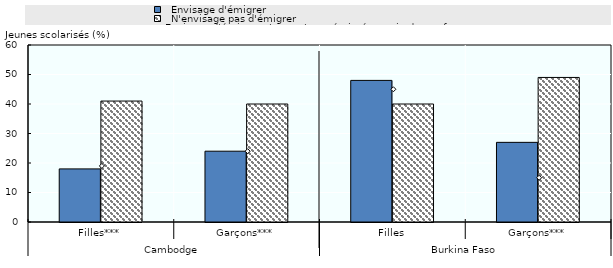
| Category |   Envisage d'émigrer |   N'envisage pas d'émigrer |
|---|---|---|
| 0 | 18 | 41 |
| 1 | 24 | 40 |
| 2 | 48 | 40 |
| 3 | 27 | 49 |